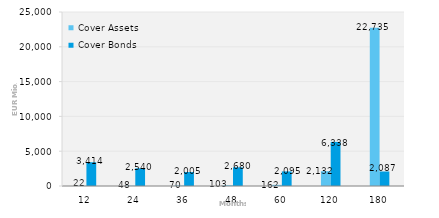
| Category | Cover Assets | Cover Bonds |
|---|---|---|
| 12.0 | 22.189 | 3414.489 |
| 24.0 | 48.436 | 2539.653 |
| 36.0 | 70.304 | 2005 |
| 48.0 | 102.818 | 2680.286 |
| 60.0 | 161.51 | 2094.5 |
| 120.0 | 2131.684 | 6337.516 |
| 180.0 | 22734.533 | 2087.256 |